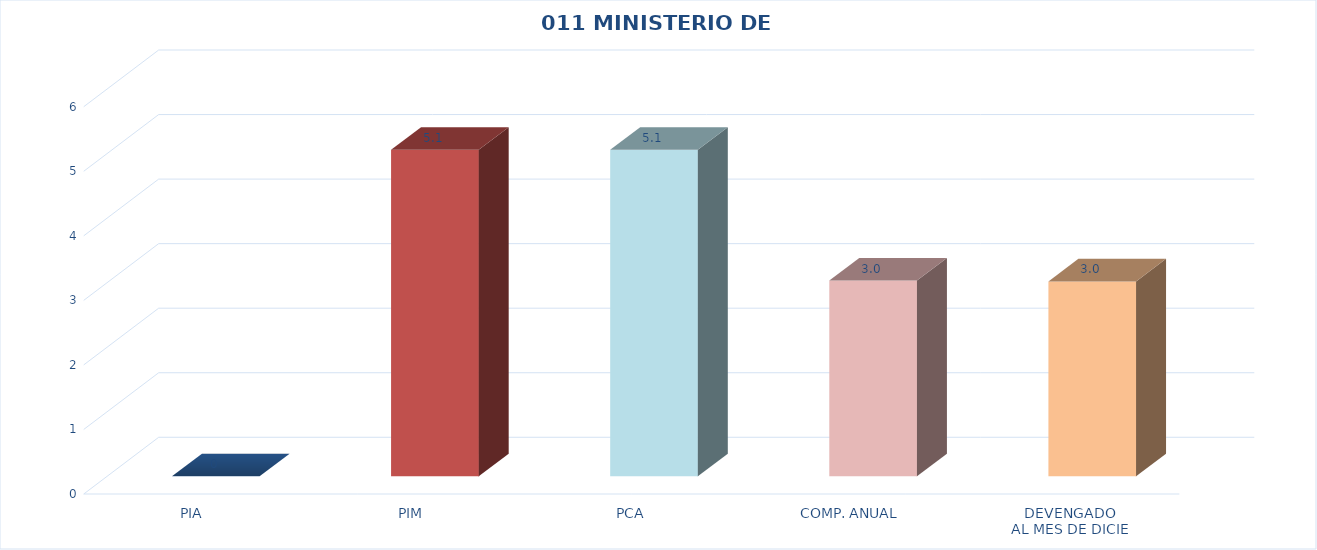
| Category | 011 MINISTERIO DE SALUD |
|---|---|
| PIA | 0 |
| PIM | 5.058 |
| PCA | 5.058 |
| COMP. ANUAL | 3.032 |
| DEVENGADO
AL MES DE DICIE | 3.019 |